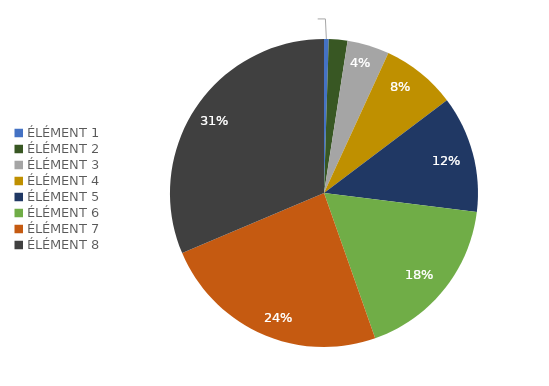
| Category | Series 0 | Series 1 |
|---|---|---|
| ÉLÉMENT 1 | 0.005 | 0.005 |
| ÉLÉMENT 2 | 0.02 | 0.02 |
| ÉLÉMENT 3 | 0.044 | 0.044 |
| ÉLÉMENT 4 | 0.078 | 0.078 |
| ÉLÉMENT 5 | 0.123 | 0.123 |
| ÉLÉMENT 6 | 0.176 | 0.176 |
| ÉLÉMENT 7 | 0.24 | 0.24 |
| ÉLÉMENT 8 | 0.314 | 0.314 |